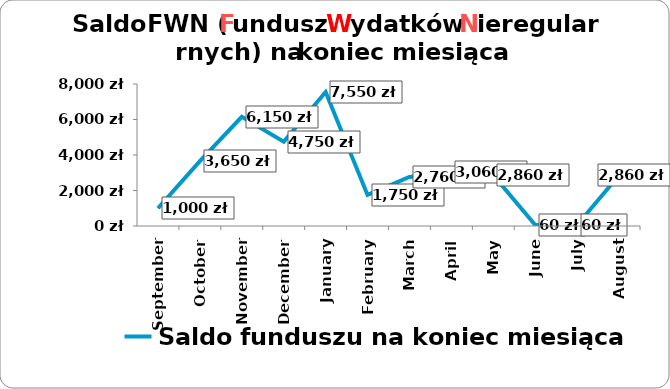
| Category | Saldo funduszu na koniec miesiąca |
|---|---|
| 2023-09-01 | 1000 |
| 2023-10-01 | 3650 |
| 2023-11-01 | 6150 |
| 2023-12-01 | 4750 |
| 2024-01-01 | 7550 |
| 2024-02-01 | 1750 |
| 2024-03-01 | 2760 |
| 2024-04-01 | 3060 |
| 2024-05-01 | 2860 |
| 2024-06-01 | 60 |
| 2024-07-01 | 60 |
| 2024-08-01 | 2860 |